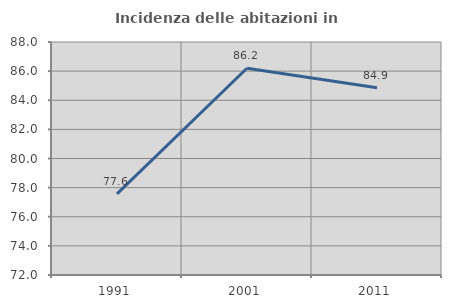
| Category | Incidenza delle abitazioni in proprietà  |
|---|---|
| 1991.0 | 77.568 |
| 2001.0 | 86.194 |
| 2011.0 | 84.851 |